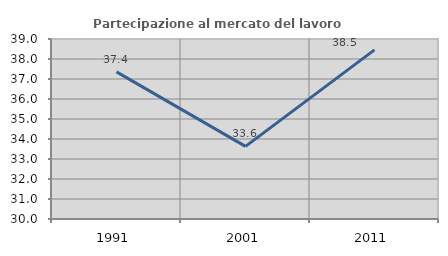
| Category | Partecipazione al mercato del lavoro  femminile |
|---|---|
| 1991.0 | 37.357 |
| 2001.0 | 33.631 |
| 2011.0 | 38.454 |